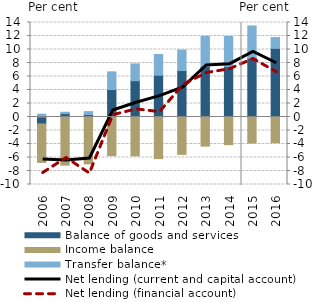
| Category | Balance of goods and services | Income balance | Transfer balance* |
|---|---|---|---|
| 2006.0 | -1.031 | -5.7 | 0.418 |
| 2007.0 | 0.498 | -7.131 | 0.202 |
| 2008.0 | 0.36 | -6.946 | 0.439 |
| 2009.0 | 4.069 | -5.722 | 2.617 |
| 2010.0 | 5.375 | -5.752 | 2.492 |
| 2011.0 | 6.189 | -6.165 | 3.071 |
| 2012.0 | 6.879 | -5.533 | 3.049 |
| 2013.0 | 7.47 | -4.312 | 4.47 |
| 2014.0 | 7.468 | -4.096 | 4.454 |
| 2015.0 | 8.724 | -3.855 | 4.768 |
| 2016.0 | 10.167 | -3.803 | 1.598 |